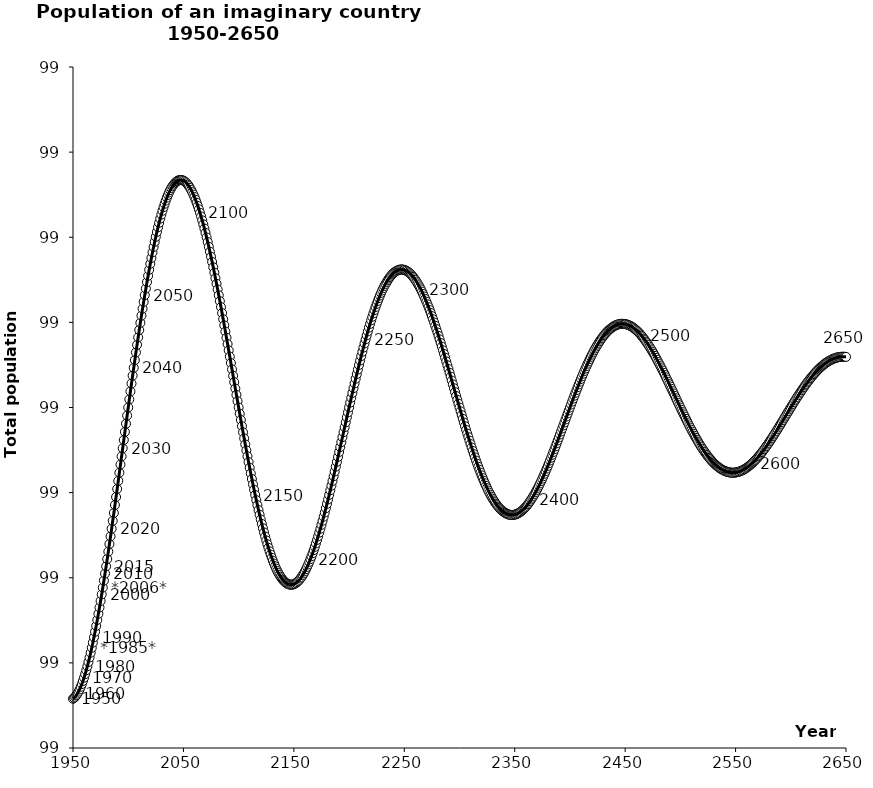
| Category | Series 0 |
|---|---|
| 1950.0 | 98.658 |
| 1951.0 | 98.659 |
| 1952.0 | 98.66 |
| 1953.0 | 98.662 |
| 1954.0 | 98.664 |
| 1955.0 | 98.666 |
| 1956.0 | 98.669 |
| 1957.0 | 98.672 |
| 1958.0 | 98.675 |
| 1959.0 | 98.679 |
| 1960.0 | 98.683 |
| 1961.0 | 98.687 |
| 1962.0 | 98.691 |
| 1963.0 | 98.696 |
| 1964.0 | 98.701 |
| 1965.0 | 98.706 |
| 1966.0 | 98.712 |
| 1967.0 | 98.718 |
| 1968.0 | 98.724 |
| 1969.0 | 98.73 |
| 1970.0 | 98.737 |
| 1971.0 | 98.743 |
| 1972.0 | 98.75 |
| 1973.0 | 98.758 |
| 1974.0 | 98.765 |
| 1975.0 | 98.773 |
| 1976.0 | 98.781 |
| 1977.0 | 98.788 |
| 1978.0 | 98.797 |
| 1979.0 | 98.805 |
| 1980.0 | 98.813 |
| 1981.0 | 98.822 |
| 1982.0 | 98.831 |
| 1983.0 | 98.84 |
| 1984.0 | 98.849 |
| 1985.0 | 98.858 |
| 1986.0 | 98.867 |
| 1987.0 | 98.876 |
| 1988.0 | 98.885 |
| 1989.0 | 98.895 |
| 1990.0 | 98.904 |
| 1991.0 | 98.914 |
| 1992.0 | 98.923 |
| 1993.0 | 98.933 |
| 1994.0 | 98.943 |
| 1995.0 | 98.952 |
| 1996.0 | 98.962 |
| 1997.0 | 98.971 |
| 1998.0 | 98.981 |
| 1999.0 | 98.99 |
| 2000.0 | 99 |
| 2001.0 | 99.009 |
| 2002.0 | 99.019 |
| 2003.0 | 99.028 |
| 2004.0 | 99.037 |
| 2005.0 | 99.047 |
| 2006.0 | 99.056 |
| 2007.0 | 99.065 |
| 2008.0 | 99.074 |
| 2009.0 | 99.082 |
| 2010.0 | 99.091 |
| 2011.0 | 99.1 |
| 2012.0 | 99.108 |
| 2013.0 | 99.116 |
| 2014.0 | 99.124 |
| 2015.0 | 99.132 |
| 2016.0 | 99.14 |
| 2017.0 | 99.147 |
| 2018.0 | 99.155 |
| 2019.0 | 99.162 |
| 2020.0 | 99.169 |
| 2021.0 | 99.176 |
| 2022.0 | 99.182 |
| 2023.0 | 99.189 |
| 2024.0 | 99.195 |
| 2025.0 | 99.201 |
| 2026.0 | 99.206 |
| 2027.0 | 99.212 |
| 2028.0 | 99.217 |
| 2029.0 | 99.222 |
| 2030.0 | 99.227 |
| 2031.0 | 99.231 |
| 2032.0 | 99.235 |
| 2033.0 | 99.239 |
| 2034.0 | 99.243 |
| 2035.0 | 99.247 |
| 2036.0 | 99.25 |
| 2037.0 | 99.253 |
| 2038.0 | 99.255 |
| 2039.0 | 99.258 |
| 2040.0 | 99.26 |
| 2041.0 | 99.262 |
| 2042.0 | 99.263 |
| 2043.0 | 99.265 |
| 2044.0 | 99.266 |
| 2045.0 | 99.267 |
| 2046.0 | 99.267 |
| 2047.0 | 99.267 |
| 2048.0 | 99.267 |
| 2049.0 | 99.267 |
| 2050.0 | 99.266 |
| 2051.0 | 99.266 |
| 2052.0 | 99.265 |
| 2053.0 | 99.263 |
| 2054.0 | 99.262 |
| 2055.0 | 99.26 |
| 2056.0 | 99.258 |
| 2057.0 | 99.256 |
| 2058.0 | 99.253 |
| 2059.0 | 99.25 |
| 2060.0 | 99.247 |
| 2061.0 | 99.244 |
| 2062.0 | 99.24 |
| 2063.0 | 99.237 |
| 2064.0 | 99.233 |
| 2065.0 | 99.229 |
| 2066.0 | 99.224 |
| 2067.0 | 99.22 |
| 2068.0 | 99.215 |
| 2069.0 | 99.21 |
| 2070.0 | 99.205 |
| 2071.0 | 99.2 |
| 2072.0 | 99.194 |
| 2073.0 | 99.189 |
| 2074.0 | 99.183 |
| 2075.0 | 99.177 |
| 2076.0 | 99.171 |
| 2077.0 | 99.165 |
| 2078.0 | 99.158 |
| 2079.0 | 99.152 |
| 2080.0 | 99.145 |
| 2081.0 | 99.139 |
| 2082.0 | 99.132 |
| 2083.0 | 99.125 |
| 2084.0 | 99.118 |
| 2085.0 | 99.111 |
| 2086.0 | 99.104 |
| 2087.0 | 99.096 |
| 2088.0 | 99.089 |
| 2089.0 | 99.082 |
| 2090.0 | 99.075 |
| 2091.0 | 99.067 |
| 2092.0 | 99.06 |
| 2093.0 | 99.052 |
| 2094.0 | 99.045 |
| 2095.0 | 99.037 |
| 2096.0 | 99.03 |
| 2097.0 | 99.022 |
| 2098.0 | 99.015 |
| 2099.0 | 99.007 |
| 2100.0 | 99 |
| 2101.0 | 98.993 |
| 2102.0 | 98.985 |
| 2103.0 | 98.978 |
| 2104.0 | 98.971 |
| 2105.0 | 98.964 |
| 2106.0 | 98.957 |
| 2107.0 | 98.95 |
| 2108.0 | 98.943 |
| 2109.0 | 98.936 |
| 2110.0 | 98.929 |
| 2111.0 | 98.922 |
| 2112.0 | 98.916 |
| 2113.0 | 98.91 |
| 2114.0 | 98.903 |
| 2115.0 | 98.897 |
| 2116.0 | 98.891 |
| 2117.0 | 98.885 |
| 2118.0 | 98.88 |
| 2119.0 | 98.874 |
| 2120.0 | 98.869 |
| 2121.0 | 98.863 |
| 2122.0 | 98.858 |
| 2123.0 | 98.853 |
| 2124.0 | 98.848 |
| 2125.0 | 98.844 |
| 2126.0 | 98.839 |
| 2127.0 | 98.835 |
| 2128.0 | 98.831 |
| 2129.0 | 98.827 |
| 2130.0 | 98.823 |
| 2131.0 | 98.82 |
| 2132.0 | 98.817 |
| 2133.0 | 98.814 |
| 2134.0 | 98.811 |
| 2135.0 | 98.808 |
| 2136.0 | 98.806 |
| 2137.0 | 98.803 |
| 2138.0 | 98.801 |
| 2139.0 | 98.799 |
| 2140.0 | 98.798 |
| 2141.0 | 98.796 |
| 2142.0 | 98.795 |
| 2143.0 | 98.794 |
| 2144.0 | 98.793 |
| 2145.0 | 98.792 |
| 2146.0 | 98.792 |
| 2147.0 | 98.792 |
| 2148.0 | 98.792 |
| 2149.0 | 98.792 |
| 2150.0 | 98.792 |
| 2151.0 | 98.793 |
| 2152.0 | 98.794 |
| 2153.0 | 98.795 |
| 2154.0 | 98.796 |
| 2155.0 | 98.798 |
| 2156.0 | 98.799 |
| 2157.0 | 98.801 |
| 2158.0 | 98.803 |
| 2159.0 | 98.805 |
| 2160.0 | 98.807 |
| 2161.0 | 98.81 |
| 2162.0 | 98.813 |
| 2163.0 | 98.816 |
| 2164.0 | 98.819 |
| 2165.0 | 98.822 |
| 2166.0 | 98.825 |
| 2167.0 | 98.829 |
| 2168.0 | 98.832 |
| 2169.0 | 98.836 |
| 2170.0 | 98.84 |
| 2171.0 | 98.844 |
| 2172.0 | 98.849 |
| 2173.0 | 98.853 |
| 2174.0 | 98.858 |
| 2175.0 | 98.862 |
| 2176.0 | 98.867 |
| 2177.0 | 98.872 |
| 2178.0 | 98.877 |
| 2179.0 | 98.882 |
| 2180.0 | 98.887 |
| 2181.0 | 98.892 |
| 2182.0 | 98.897 |
| 2183.0 | 98.903 |
| 2184.0 | 98.908 |
| 2185.0 | 98.914 |
| 2186.0 | 98.919 |
| 2187.0 | 98.925 |
| 2188.0 | 98.931 |
| 2189.0 | 98.936 |
| 2190.0 | 98.942 |
| 2191.0 | 98.948 |
| 2192.0 | 98.954 |
| 2193.0 | 98.959 |
| 2194.0 | 98.965 |
| 2195.0 | 98.971 |
| 2196.0 | 98.977 |
| 2197.0 | 98.983 |
| 2198.0 | 98.988 |
| 2199.0 | 98.994 |
| 2200.0 | 99 |
| 2201.0 | 99.006 |
| 2202.0 | 99.011 |
| 2203.0 | 99.017 |
| 2204.0 | 99.023 |
| 2205.0 | 99.028 |
| 2206.0 | 99.034 |
| 2207.0 | 99.039 |
| 2208.0 | 99.045 |
| 2209.0 | 99.05 |
| 2210.0 | 99.055 |
| 2211.0 | 99.06 |
| 2212.0 | 99.065 |
| 2213.0 | 99.07 |
| 2214.0 | 99.075 |
| 2215.0 | 99.08 |
| 2216.0 | 99.085 |
| 2217.0 | 99.089 |
| 2218.0 | 99.094 |
| 2219.0 | 99.098 |
| 2220.0 | 99.102 |
| 2221.0 | 99.107 |
| 2222.0 | 99.111 |
| 2223.0 | 99.114 |
| 2224.0 | 99.118 |
| 2225.0 | 99.122 |
| 2226.0 | 99.125 |
| 2227.0 | 99.128 |
| 2228.0 | 99.132 |
| 2229.0 | 99.135 |
| 2230.0 | 99.137 |
| 2231.0 | 99.14 |
| 2232.0 | 99.143 |
| 2233.0 | 99.145 |
| 2234.0 | 99.147 |
| 2235.0 | 99.15 |
| 2236.0 | 99.151 |
| 2237.0 | 99.153 |
| 2238.0 | 99.155 |
| 2239.0 | 99.156 |
| 2240.0 | 99.158 |
| 2241.0 | 99.159 |
| 2242.0 | 99.16 |
| 2243.0 | 99.161 |
| 2244.0 | 99.161 |
| 2245.0 | 99.162 |
| 2246.0 | 99.162 |
| 2247.0 | 99.162 |
| 2248.0 | 99.162 |
| 2249.0 | 99.162 |
| 2250.0 | 99.162 |
| 2251.0 | 99.161 |
| 2252.0 | 99.161 |
| 2253.0 | 99.16 |
| 2254.0 | 99.159 |
| 2255.0 | 99.158 |
| 2256.0 | 99.156 |
| 2257.0 | 99.155 |
| 2258.0 | 99.153 |
| 2259.0 | 99.152 |
| 2260.0 | 99.15 |
| 2261.0 | 99.148 |
| 2262.0 | 99.146 |
| 2263.0 | 99.144 |
| 2264.0 | 99.141 |
| 2265.0 | 99.139 |
| 2266.0 | 99.136 |
| 2267.0 | 99.133 |
| 2268.0 | 99.13 |
| 2269.0 | 99.127 |
| 2270.0 | 99.124 |
| 2271.0 | 99.121 |
| 2272.0 | 99.118 |
| 2273.0 | 99.114 |
| 2274.0 | 99.111 |
| 2275.0 | 99.107 |
| 2276.0 | 99.104 |
| 2277.0 | 99.1 |
| 2278.0 | 99.096 |
| 2279.0 | 99.092 |
| 2280.0 | 99.088 |
| 2281.0 | 99.084 |
| 2282.0 | 99.08 |
| 2283.0 | 99.076 |
| 2284.0 | 99.072 |
| 2285.0 | 99.067 |
| 2286.0 | 99.063 |
| 2287.0 | 99.059 |
| 2288.0 | 99.054 |
| 2289.0 | 99.05 |
| 2290.0 | 99.045 |
| 2291.0 | 99.041 |
| 2292.0 | 99.036 |
| 2293.0 | 99.032 |
| 2294.0 | 99.027 |
| 2295.0 | 99.023 |
| 2296.0 | 99.018 |
| 2297.0 | 99.014 |
| 2298.0 | 99.009 |
| 2299.0 | 99.004 |
| 2300.0 | 99 |
| 2301.0 | 98.996 |
| 2302.0 | 98.991 |
| 2303.0 | 98.987 |
| 2304.0 | 98.982 |
| 2305.0 | 98.978 |
| 2306.0 | 98.974 |
| 2307.0 | 98.969 |
| 2308.0 | 98.965 |
| 2309.0 | 98.961 |
| 2310.0 | 98.957 |
| 2311.0 | 98.953 |
| 2312.0 | 98.949 |
| 2313.0 | 98.945 |
| 2314.0 | 98.941 |
| 2315.0 | 98.938 |
| 2316.0 | 98.934 |
| 2317.0 | 98.93 |
| 2318.0 | 98.927 |
| 2319.0 | 98.924 |
| 2320.0 | 98.92 |
| 2321.0 | 98.917 |
| 2322.0 | 98.914 |
| 2323.0 | 98.911 |
| 2324.0 | 98.908 |
| 2325.0 | 98.905 |
| 2326.0 | 98.903 |
| 2327.0 | 98.9 |
| 2328.0 | 98.898 |
| 2329.0 | 98.895 |
| 2330.0 | 98.893 |
| 2331.0 | 98.891 |
| 2332.0 | 98.889 |
| 2333.0 | 98.887 |
| 2334.0 | 98.885 |
| 2335.0 | 98.884 |
| 2336.0 | 98.882 |
| 2337.0 | 98.881 |
| 2338.0 | 98.879 |
| 2339.0 | 98.878 |
| 2340.0 | 98.877 |
| 2341.0 | 98.876 |
| 2342.0 | 98.876 |
| 2343.0 | 98.875 |
| 2344.0 | 98.874 |
| 2345.0 | 98.874 |
| 2346.0 | 98.874 |
| 2347.0 | 98.874 |
| 2348.0 | 98.874 |
| 2349.0 | 98.874 |
| 2350.0 | 98.874 |
| 2351.0 | 98.874 |
| 2352.0 | 98.875 |
| 2353.0 | 98.876 |
| 2354.0 | 98.876 |
| 2355.0 | 98.877 |
| 2356.0 | 98.878 |
| 2357.0 | 98.879 |
| 2358.0 | 98.88 |
| 2359.0 | 98.882 |
| 2360.0 | 98.883 |
| 2361.0 | 98.885 |
| 2362.0 | 98.886 |
| 2363.0 | 98.888 |
| 2364.0 | 98.89 |
| 2365.0 | 98.892 |
| 2366.0 | 98.894 |
| 2367.0 | 98.896 |
| 2368.0 | 98.898 |
| 2369.0 | 98.901 |
| 2370.0 | 98.903 |
| 2371.0 | 98.906 |
| 2372.0 | 98.908 |
| 2373.0 | 98.911 |
| 2374.0 | 98.914 |
| 2375.0 | 98.916 |
| 2376.0 | 98.919 |
| 2377.0 | 98.922 |
| 2378.0 | 98.925 |
| 2379.0 | 98.928 |
| 2380.0 | 98.931 |
| 2381.0 | 98.935 |
| 2382.0 | 98.938 |
| 2383.0 | 98.941 |
| 2384.0 | 98.944 |
| 2385.0 | 98.948 |
| 2386.0 | 98.951 |
| 2387.0 | 98.954 |
| 2388.0 | 98.958 |
| 2389.0 | 98.961 |
| 2390.0 | 98.965 |
| 2391.0 | 98.968 |
| 2392.0 | 98.972 |
| 2393.0 | 98.975 |
| 2394.0 | 98.979 |
| 2395.0 | 98.982 |
| 2396.0 | 98.986 |
| 2397.0 | 98.989 |
| 2398.0 | 98.993 |
| 2399.0 | 98.997 |
| 2400.0 | 99 |
| 2401.0 | 99.003 |
| 2402.0 | 99.007 |
| 2403.0 | 99.01 |
| 2404.0 | 99.014 |
| 2405.0 | 99.017 |
| 2406.0 | 99.021 |
| 2407.0 | 99.024 |
| 2408.0 | 99.027 |
| 2409.0 | 99.03 |
| 2410.0 | 99.033 |
| 2411.0 | 99.037 |
| 2412.0 | 99.04 |
| 2413.0 | 99.043 |
| 2414.0 | 99.046 |
| 2415.0 | 99.049 |
| 2416.0 | 99.051 |
| 2417.0 | 99.054 |
| 2418.0 | 99.057 |
| 2419.0 | 99.06 |
| 2420.0 | 99.062 |
| 2421.0 | 99.065 |
| 2422.0 | 99.067 |
| 2423.0 | 99.069 |
| 2424.0 | 99.072 |
| 2425.0 | 99.074 |
| 2426.0 | 99.076 |
| 2427.0 | 99.078 |
| 2428.0 | 99.08 |
| 2429.0 | 99.082 |
| 2430.0 | 99.083 |
| 2431.0 | 99.085 |
| 2432.0 | 99.087 |
| 2433.0 | 99.088 |
| 2434.0 | 99.089 |
| 2435.0 | 99.091 |
| 2436.0 | 99.092 |
| 2437.0 | 99.093 |
| 2438.0 | 99.094 |
| 2439.0 | 99.095 |
| 2440.0 | 99.096 |
| 2441.0 | 99.096 |
| 2442.0 | 99.097 |
| 2443.0 | 99.097 |
| 2444.0 | 99.098 |
| 2445.0 | 99.098 |
| 2446.0 | 99.098 |
| 2447.0 | 99.098 |
| 2448.0 | 99.098 |
| 2449.0 | 99.098 |
| 2450.0 | 99.098 |
| 2451.0 | 99.098 |
| 2452.0 | 99.097 |
| 2453.0 | 99.097 |
| 2454.0 | 99.096 |
| 2455.0 | 99.096 |
| 2456.0 | 99.095 |
| 2457.0 | 99.094 |
| 2458.0 | 99.093 |
| 2459.0 | 99.092 |
| 2460.0 | 99.091 |
| 2461.0 | 99.09 |
| 2462.0 | 99.088 |
| 2463.0 | 99.087 |
| 2464.0 | 99.086 |
| 2465.0 | 99.084 |
| 2466.0 | 99.083 |
| 2467.0 | 99.081 |
| 2468.0 | 99.079 |
| 2469.0 | 99.077 |
| 2470.0 | 99.075 |
| 2471.0 | 99.074 |
| 2472.0 | 99.071 |
| 2473.0 | 99.069 |
| 2474.0 | 99.067 |
| 2475.0 | 99.065 |
| 2476.0 | 99.063 |
| 2477.0 | 99.061 |
| 2478.0 | 99.058 |
| 2479.0 | 99.056 |
| 2480.0 | 99.053 |
| 2481.0 | 99.051 |
| 2482.0 | 99.048 |
| 2483.0 | 99.046 |
| 2484.0 | 99.043 |
| 2485.0 | 99.041 |
| 2486.0 | 99.038 |
| 2487.0 | 99.035 |
| 2488.0 | 99.033 |
| 2489.0 | 99.03 |
| 2490.0 | 99.027 |
| 2491.0 | 99.025 |
| 2492.0 | 99.022 |
| 2493.0 | 99.019 |
| 2494.0 | 99.016 |
| 2495.0 | 99.014 |
| 2496.0 | 99.011 |
| 2497.0 | 99.008 |
| 2498.0 | 99.005 |
| 2499.0 | 99.003 |
| 2500.0 | 99 |
| 2501.0 | 98.997 |
| 2502.0 | 98.995 |
| 2503.0 | 98.992 |
| 2504.0 | 98.989 |
| 2505.0 | 98.987 |
| 2506.0 | 98.984 |
| 2507.0 | 98.981 |
| 2508.0 | 98.979 |
| 2509.0 | 98.976 |
| 2510.0 | 98.974 |
| 2511.0 | 98.971 |
| 2512.0 | 98.969 |
| 2513.0 | 98.967 |
| 2514.0 | 98.964 |
| 2515.0 | 98.962 |
| 2516.0 | 98.96 |
| 2517.0 | 98.958 |
| 2518.0 | 98.956 |
| 2519.0 | 98.954 |
| 2520.0 | 98.952 |
| 2521.0 | 98.95 |
| 2522.0 | 98.948 |
| 2523.0 | 98.946 |
| 2524.0 | 98.944 |
| 2525.0 | 98.943 |
| 2526.0 | 98.941 |
| 2527.0 | 98.939 |
| 2528.0 | 98.938 |
| 2529.0 | 98.936 |
| 2530.0 | 98.935 |
| 2531.0 | 98.934 |
| 2532.0 | 98.933 |
| 2533.0 | 98.931 |
| 2534.0 | 98.93 |
| 2535.0 | 98.929 |
| 2536.0 | 98.928 |
| 2537.0 | 98.928 |
| 2538.0 | 98.927 |
| 2539.0 | 98.926 |
| 2540.0 | 98.926 |
| 2541.0 | 98.925 |
| 2542.0 | 98.925 |
| 2543.0 | 98.924 |
| 2544.0 | 98.924 |
| 2545.0 | 98.924 |
| 2546.0 | 98.923 |
| 2547.0 | 98.923 |
| 2548.0 | 98.923 |
| 2549.0 | 98.923 |
| 2550.0 | 98.924 |
| 2551.0 | 98.924 |
| 2552.0 | 98.924 |
| 2553.0 | 98.925 |
| 2554.0 | 98.925 |
| 2555.0 | 98.926 |
| 2556.0 | 98.926 |
| 2557.0 | 98.927 |
| 2558.0 | 98.928 |
| 2559.0 | 98.928 |
| 2560.0 | 98.929 |
| 2561.0 | 98.93 |
| 2562.0 | 98.931 |
| 2563.0 | 98.932 |
| 2564.0 | 98.933 |
| 2565.0 | 98.934 |
| 2566.0 | 98.936 |
| 2567.0 | 98.937 |
| 2568.0 | 98.938 |
| 2569.0 | 98.94 |
| 2570.0 | 98.941 |
| 2571.0 | 98.943 |
| 2572.0 | 98.944 |
| 2573.0 | 98.946 |
| 2574.0 | 98.948 |
| 2575.0 | 98.949 |
| 2576.0 | 98.951 |
| 2577.0 | 98.953 |
| 2578.0 | 98.955 |
| 2579.0 | 98.956 |
| 2580.0 | 98.958 |
| 2581.0 | 98.96 |
| 2582.0 | 98.962 |
| 2583.0 | 98.964 |
| 2584.0 | 98.966 |
| 2585.0 | 98.968 |
| 2586.0 | 98.97 |
| 2587.0 | 98.972 |
| 2588.0 | 98.974 |
| 2589.0 | 98.977 |
| 2590.0 | 98.979 |
| 2591.0 | 98.981 |
| 2592.0 | 98.983 |
| 2593.0 | 98.985 |
| 2594.0 | 98.987 |
| 2595.0 | 98.989 |
| 2596.0 | 98.991 |
| 2597.0 | 98.994 |
| 2598.0 | 98.996 |
| 2599.0 | 98.998 |
| 2600.0 | 99 |
| 2601.0 | 99.002 |
| 2602.0 | 99.004 |
| 2603.0 | 99.006 |
| 2604.0 | 99.008 |
| 2605.0 | 99.01 |
| 2606.0 | 99.012 |
| 2607.0 | 99.014 |
| 2608.0 | 99.016 |
| 2609.0 | 99.018 |
| 2610.0 | 99.02 |
| 2611.0 | 99.022 |
| 2612.0 | 99.024 |
| 2613.0 | 99.026 |
| 2614.0 | 99.028 |
| 2615.0 | 99.029 |
| 2616.0 | 99.031 |
| 2617.0 | 99.033 |
| 2618.0 | 99.035 |
| 2619.0 | 99.036 |
| 2620.0 | 99.038 |
| 2621.0 | 99.039 |
| 2622.0 | 99.041 |
| 2623.0 | 99.042 |
| 2624.0 | 99.043 |
| 2625.0 | 99.045 |
| 2626.0 | 99.046 |
| 2627.0 | 99.047 |
| 2628.0 | 99.048 |
| 2629.0 | 99.05 |
| 2630.0 | 99.051 |
| 2631.0 | 99.052 |
| 2632.0 | 99.053 |
| 2633.0 | 99.053 |
| 2634.0 | 99.054 |
| 2635.0 | 99.055 |
| 2636.0 | 99.056 |
| 2637.0 | 99.056 |
| 2638.0 | 99.057 |
| 2639.0 | 99.058 |
| 2640.0 | 99.058 |
| 2641.0 | 99.058 |
| 2642.0 | 99.059 |
| 2643.0 | 99.059 |
| 2644.0 | 99.059 |
| 2645.0 | 99.059 |
| 2646.0 | 99.06 |
| 2647.0 | 99.06 |
| 2648.0 | 99.06 |
| 2649.0 | 99.06 |
| 2650.0 | 99.059 |